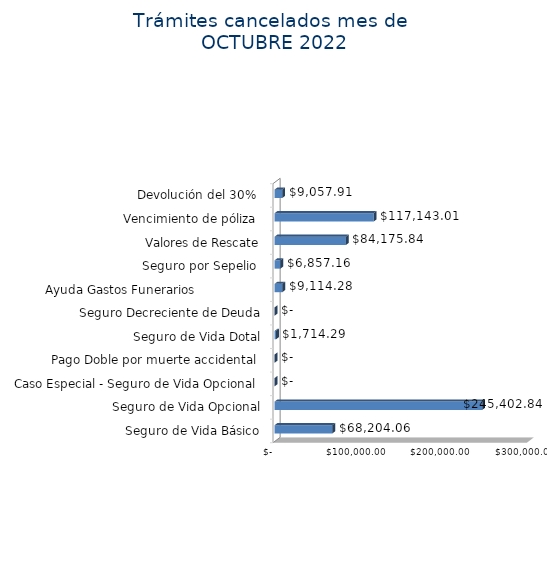
| Category | Monto  |
|---|---|
| Seguro de Vida Básico | 68204.06 |
| Seguro de Vida Opcional | 245402.84 |
| Caso Especial - Seguro de Vida Opcional  | 0 |
| Pago Doble por muerte accidental  | 0 |
| Seguro de Vida Dotal | 1714.29 |
| Seguro Decreciente de Deuda | 0 |
| Ayuda Gastos Funerarios                  | 9114.28 |
| Seguro por Sepelio  | 6857.16 |
| Valores de Rescate | 84175.84 |
| Vencimiento de póliza  | 117143.01 |
| Devolución del 30%  | 9057.91 |